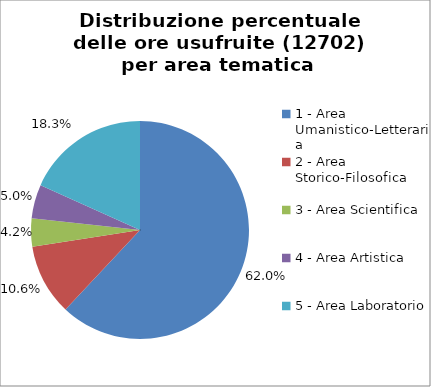
| Category | Nr. Ore Usufruite |
|---|---|
| 1 - Area Umanistico-Letteraria | 7872 |
| 2 - Area Storico-Filosofica | 1341 |
| 3 - Area Scientifica | 531 |
| 4 - Area Artistica | 636 |
| 5 - Area Laboratorio | 2322 |